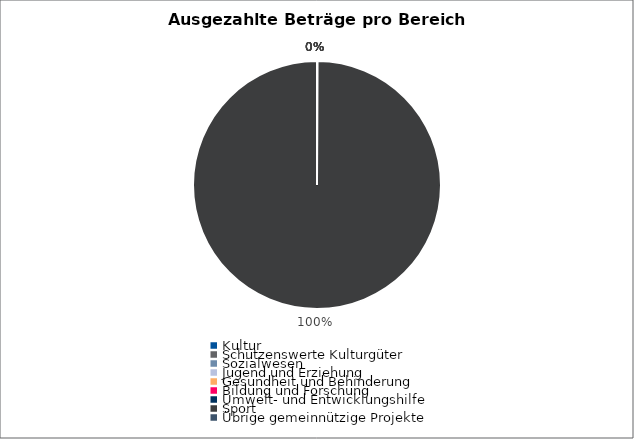
| Category | Series 0 |
|---|---|
| Kultur | 0 |
| Schützenswerte Kulturgüter | 0 |
| Sozialwesen | 0 |
| Jugend und Erziehung | 0 |
| Gesundheit und Behinderung | 0 |
| Bildung und Forschung | 0 |
| Umwelt- und Entwicklungshilfe | 0 |
| Sport | 4039516 |
| Übrige gemeinnützige Projekte | 0 |